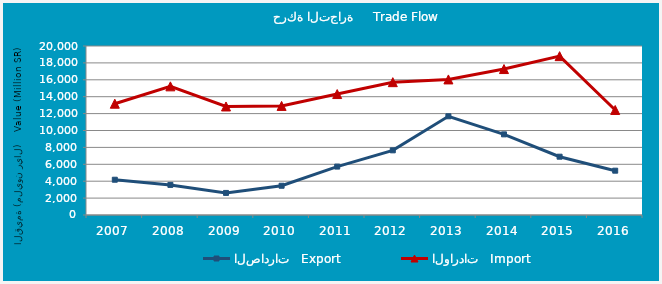
| Category | الصادرات   Export | الواردات   Import |
|---|---|---|
| 2007.0 | 4175.2 | 13169.592 |
| 2008.0 | 3561.828 | 15224.8 |
| 2009.0 | 2612.039 | 12842.266 |
| 2010.0 | 3460.619 | 12908.931 |
| 2011.0 | 5729.612 | 14312.57 |
| 2012.0 | 7652.019 | 15719.46 |
| 2013.0 | 11683.414 | 16043.105 |
| 2014.0 | 9543.161 | 17271.165 |
| 2015.0 | 6899.316 | 18799.232 |
| 2016.0 | 5245.015 | 12428.714 |